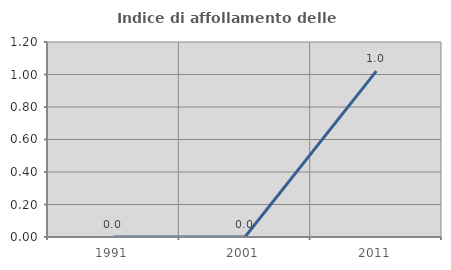
| Category | Indice di affollamento delle abitazioni  |
|---|---|
| 1991.0 | 0 |
| 2001.0 | 0 |
| 2011.0 | 1.02 |